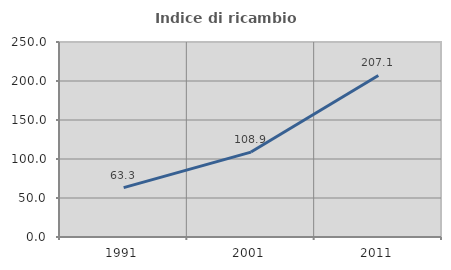
| Category | Indice di ricambio occupazionale  |
|---|---|
| 1991.0 | 63.267 |
| 2001.0 | 108.884 |
| 2011.0 | 207.053 |